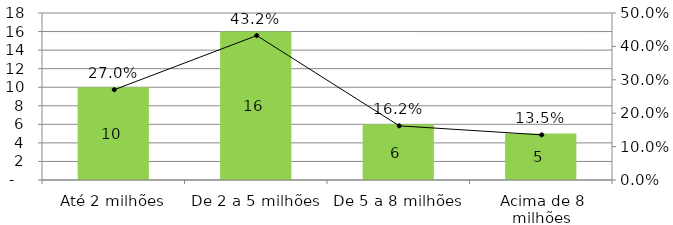
| Category | Quantidade de obras |
|---|---|
| Até 2 milhões | 10 |
| De 2 a 5 milhões | 16 |
| De 5 a 8 milhões | 6 |
| Acima de 8 milhões | 5 |